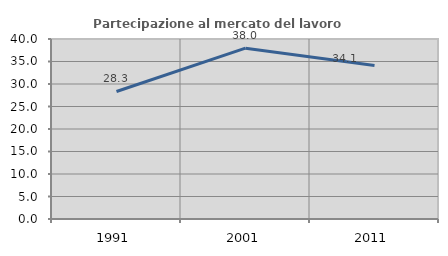
| Category | Partecipazione al mercato del lavoro  femminile |
|---|---|
| 1991.0 | 28.335 |
| 2001.0 | 37.956 |
| 2011.0 | 34.118 |